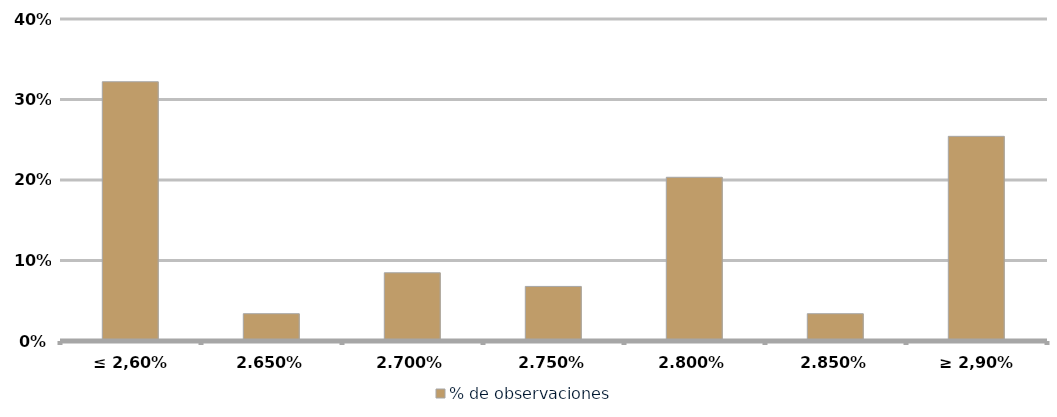
| Category | % de observaciones  |
|---|---|
| ≤ 2,60% | 0.322 |
| 2,65% | 0.034 |
| 2,70% | 0.085 |
| 2,75% | 0.068 |
| 2,80% | 0.203 |
| 2,85% | 0.034 |
| ≥ 2,90% | 0.254 |